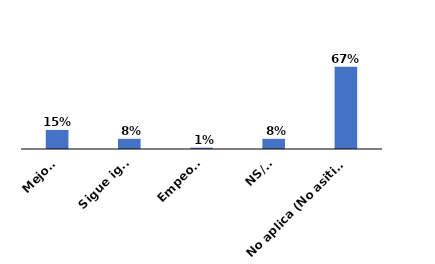
| Category | Series 0 |
|---|---|
| Mejoró | 0.155 |
| Sigue igual | 0.083 |
| Empeoró | 0.011 |
| NS/NR | 0.083 |
| No aplica (No asitió anteriormente) | 0.669 |